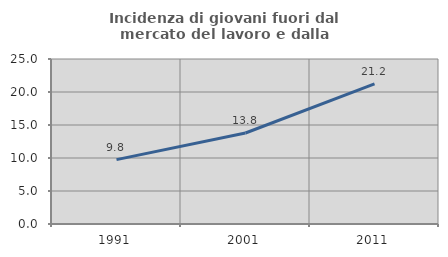
| Category | Incidenza di giovani fuori dal mercato del lavoro e dalla formazione  |
|---|---|
| 1991.0 | 9.756 |
| 2001.0 | 13.786 |
| 2011.0 | 21.231 |